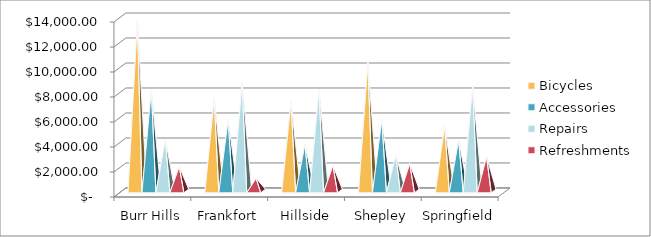
| Category | Bicycles | Accessories | Repairs | Refreshments |
|---|---|---|---|---|
| Burr Hills | 13654.49 | 8106.93 | 4158.58 | 1953.96 |
| Frankfort | 7430.9 | 5731.09 | 8665.31 | 1013.08 |
| Hillside | 7158.62 | 3742.3 | 8113.37 | 2039.34 |
| Shepley | 10264.34 | 5723.35 | 2881.45 | 2204.14 |
| Springfield | 5218 | 4084.38 | 8407.71 | 2740.46 |